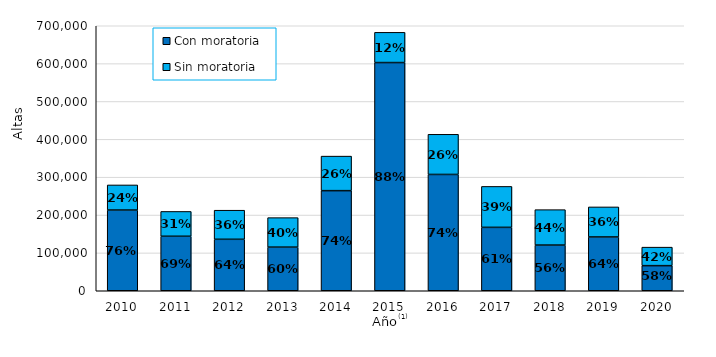
| Category | Con moratoria | Sin moratoria |
|---|---|---|
| 2010.0 | 213206 | 66327 |
| 2011.0 | 143953 | 65590 |
| 2012.0 | 135914 | 76855 |
| 2013.0 | 115219 | 77955 |
| 2014.0 | 264437 | 91245 |
| 2015.0 | 602789 | 79838 |
| 2016.0 | 307207 | 106075 |
| 2017.0 | 167483 | 108159 |
| 2018.0 | 120680 | 93603 |
| 2019.0 | 142075 | 79376 |
| 2020.0 | 66325 | 48871 |